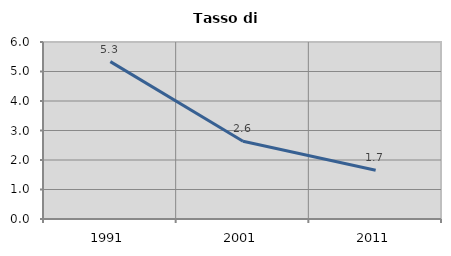
| Category | Tasso di disoccupazione   |
|---|---|
| 1991.0 | 5.336 |
| 2001.0 | 2.638 |
| 2011.0 | 1.651 |